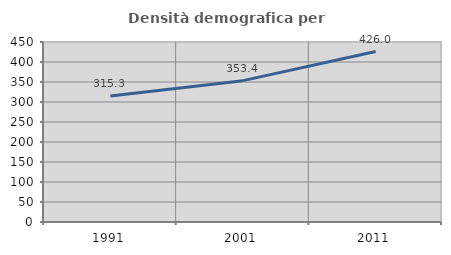
| Category | Densità demografica |
|---|---|
| 1991.0 | 315.284 |
| 2001.0 | 353.383 |
| 2011.0 | 426.029 |